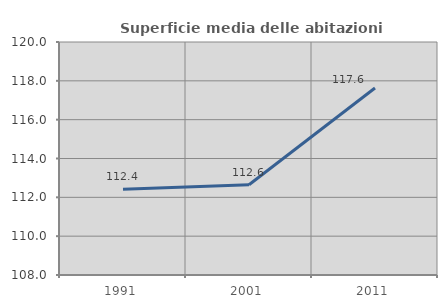
| Category | Superficie media delle abitazioni occupate |
|---|---|
| 1991.0 | 112.417 |
| 2001.0 | 112.65 |
| 2011.0 | 117.633 |